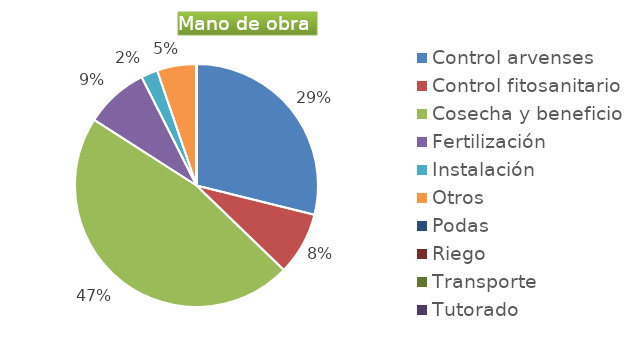
| Category | Series 0 |
|---|---|
| Control arvenses | 14020533.333 |
| Control fitosanitario | 4057200 |
| Cosecha y beneficio | 22740852 |
| Fertilización | 4116000 |
| Instalación | 1071466.667 |
| Otros | 2548000 |
| Podas | 0 |
| Riego | 0 |
| Transporte | 0 |
| Tutorado | 0 |